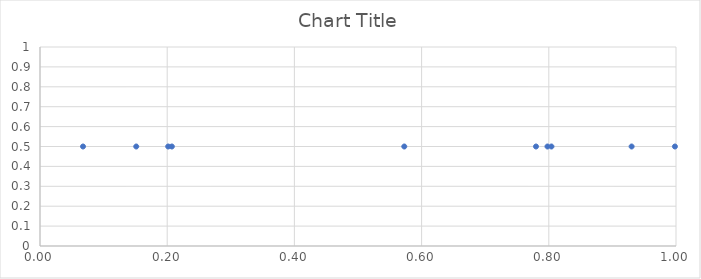
| Category | Series 0 |
|---|---|
| 0.9302233212562169 | 0.5 |
| 0.779879924611466 | 0.5 |
| 0.7979386542991196 | 0.5 |
| 0.8041397761020321 | 0.5 |
| 0.9983117758340787 | 0.5 |
| 0.5727640961883241 | 0.5 |
| 0.06762564949549876 | 0.5 |
| 0.20730183788816237 | 0.5 |
| 0.15132974918969877 | 0.5 |
| 0.20155549964810304 | 0.5 |